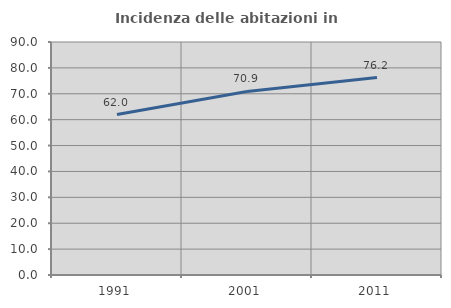
| Category | Incidenza delle abitazioni in proprietà  |
|---|---|
| 1991.0 | 61.989 |
| 2001.0 | 70.918 |
| 2011.0 | 76.248 |